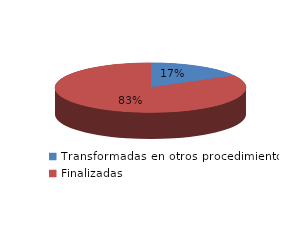
| Category | Series 0 |
|---|---|
| Transformadas en otros procedimientos | 3180 |
| Finalizadas | 15792 |